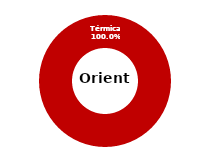
| Category | Oriente |
|---|---|
| Eólica | 0 |
| Hidráulica | 0 |
| Solar | 0 |
| Térmica | 80.893 |